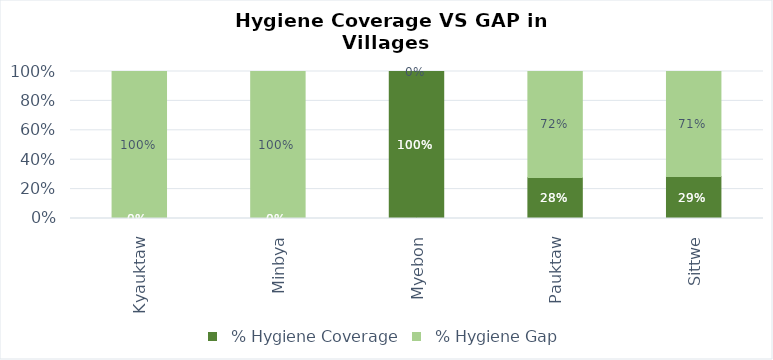
| Category |   % Hygiene Coverage |   % Hygiene Gap |
|---|---|---|
| Kyauktaw | 0 | 1 |
| Minbya | 0 | 1 |
| Myebon | 1 | 0 |
| Pauktaw | 0.279 | 0.721 |
| Sittwe | 0.286 | 0.714 |